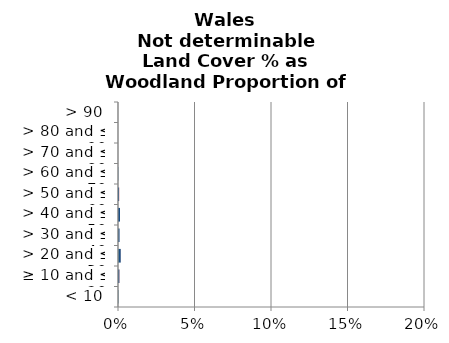
| Category | England | Scotland | Wales |
|---|---|---|---|
|  < 10 | 0 | 0 | 0 |
|  ≥ 10 and ≤ 20 | 0 | 0.001 | 0 |
|  > 20 and ≤ 30 | 0 | 0.002 | 0 |
|  > 30 and ≤ 40 | 0 | 0.001 | 0 |
|  > 40 and ≤ 50 | 0 | 0.001 | 0 |
|  > 50 and ≤ 60 | 0 | 0.001 | 0 |
|  > 60 and ≤ 70 | 0 | 0 | 0 |
|  > 70 and ≤ 80 | 0 | 0 | 0 |
|  > 80 and ≤ 90 | 0 | 0 | 0 |
|  > 90 | 0 | 0 | 0 |